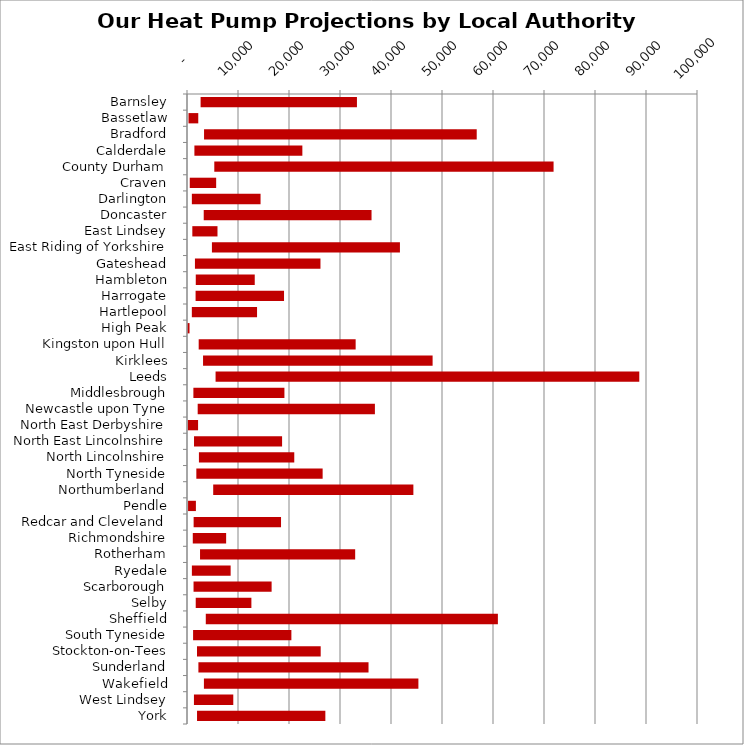
| Category | MIN | MAX |
|---|---|---|
| Barnsley | 2668 | 30654 |
| Bassetlaw | 293 | 1916 |
| Bradford | 3343 | 53465 |
| Calderdale | 1451 | 21168 |
| County Durham | 5352 | 66525 |
| Craven | 541 | 5177 |
| Darlington | 952 | 13471 |
| Doncaster | 3279 | 32905 |
| East Lindsey | 1044 | 4934 |
| East Riding of Yorkshire | 4886 | 36865 |
| Gateshead | 1557 | 24612 |
| Hambleton | 1720 | 11563 |
| Harrogate | 1683 | 17342 |
| Hartlepool | 948 | 12787 |
| High Peak | 101 | 394 |
| Kingston upon Hull | 2292 | 30777 |
| Kirklees | 3147 | 45011 |
| Leeds | 5603 | 83081 |
| Middlesbrough | 1252 | 17850 |
| Newcastle upon Tyne | 2096 | 34748 |
| North East Derbyshire | 168 | 2004 |
| North East Lincolnshire | 1376 | 17269 |
| North Lincolnshire | 2337 | 18696 |
| North Tyneside | 1831 | 24765 |
| Northumberland | 5138 | 39249 |
| Pendle | 207 | 1538 |
| Redcar and Cleveland | 1300 | 17137 |
| Richmondshire | 1134 | 6540 |
| Rotherham | 2556 | 30420 |
| Ryedale | 956 | 7601 |
| Scarborough | 1283 | 15308 |
| Selby | 1711 | 10914 |
| Sheffield | 3684 | 57274 |
| South Tyneside | 1194 | 19273 |
| Stockton-on-Tees | 1961 | 24253 |
| Sunderland | 2235 | 33358 |
| Wakefield | 3318 | 42054 |
| West Lindsey | 1361 | 7714 |
| York | 1967 | 25160 |